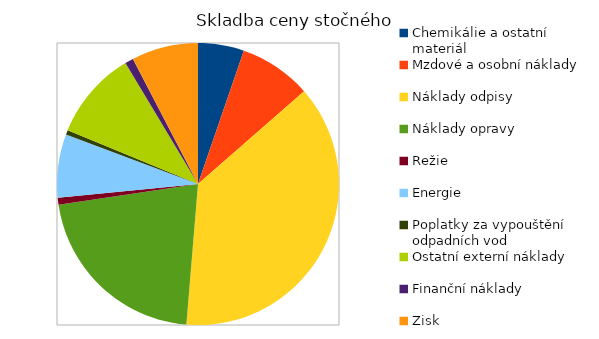
| Category | Series 0 |
|---|---|
| Chemikálie a ostatní materiál | 475000 |
| Mzdové a osobní náklady | 748000 |
| Náklady odpisy | 3404000 |
| Náklady opravy | 1924000 |
| Režie | 72000 |
| Energie | 655000 |
| Poplatky za vypouštění odpadních vod | 47000 |
| Ostatní externí náklady | 916000 |
| Finanční náklady | 88000 |
| Zisk | 688000 |